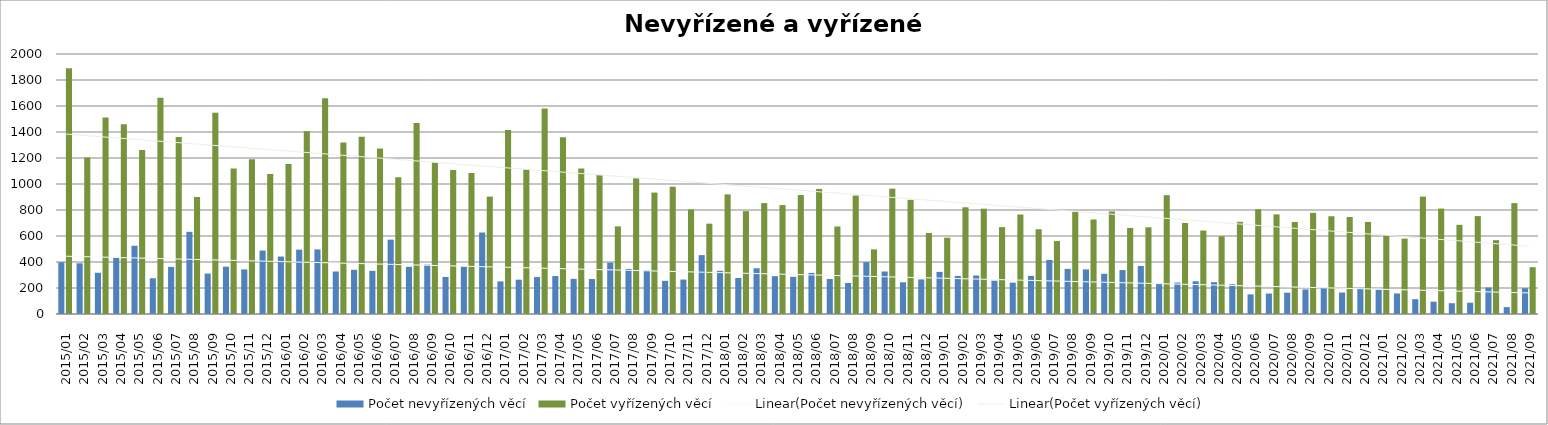
| Category | Počet nevyřízených věcí | Počet vyřízených věcí |
|---|---|---|
| 2015/01 | 398 | 1890 |
| 2015/02 | 390 | 1203 |
| 2015/03 | 317 | 1512 |
| 2015/04 | 436 | 1460 |
| 2015/05 | 525 | 1262 |
| 2015/06 | 275 | 1663 |
| 2015/07 | 362 | 1362 |
| 2015/08 | 632 | 900 |
| 2015/09 | 311 | 1548 |
| 2015/10 | 364 | 1120 |
| 2015/11 | 343 | 1191 |
| 2015/12 | 488 | 1076 |
| 2016/01 | 442 | 1154 |
| 2016/02 | 495 | 1406 |
| 2016/03 | 497 | 1659 |
| 2016/04 | 327 | 1319 |
| 2016/05 | 340 | 1363 |
| 2016/06 | 332 | 1273 |
| 2016/07 | 572 | 1051 |
| 2016/08 | 363 | 1469 |
| 2016/09 | 380 | 1167 |
| 2016/10 | 285 | 1108 |
| 2016/11 | 365 | 1084 |
| 2016/12 | 627 | 903 |
| 2017/01 | 251 | 1415 |
| 2017/02 | 264 | 1113 |
| 2017/03 | 284 | 1581 |
| 2017/04 | 292 | 1359 |
| 2017/05 | 270 | 1120 |
| 2017/06 | 269 | 1069 |
| 2017/07 | 395 | 674 |
| 2017/08 | 347 | 1045 |
| 2017/09 | 335 | 934 |
| 2017/10 | 255 | 979 |
| 2017/11 | 265 | 804 |
| 2017/12 | 453 | 695 |
| 2018/01 | 332 | 920 |
| 2018/02 | 277 | 791 |
| 2018/03 | 352 | 853 |
| 2018/04 | 291 | 838 |
| 2018/05 | 286 | 915 |
| 2018/06 | 316 | 962 |
| 2018/07 | 269 | 673 |
| 2018/08 | 239 | 911 |
| 2018/09 | 399 | 497 |
| 2018/10 | 327 | 964 |
| 2018/11 | 244 | 878 |
| 2018/12 | 266 | 623 |
| 2019/01 | 324 | 587 |
| 2019/02 | 293 | 821 |
| 2019/03 | 296 | 810 |
| 2019/04 | 256 | 668 |
| 2019/05 | 241 | 765 |
| 2019/06 | 293 | 652 |
| 2019/07 | 416 | 561 |
| 2019/08 | 347 | 787 |
| 2019/09 | 343 | 727 |
| 2019/10 | 309 | 789 |
| 2019/11 | 338 | 662 |
| 2019/12 | 369 | 667 |
| 2020/01 | 235 | 914 |
| 2020/02 | 242 | 700 |
| 2020/03 | 252 | 642 |
| 2020/04 | 245 | 598 |
| 2020/05 | 229 | 709 |
| 2020/06 | 151 | 806 |
| 2020/07 | 157 | 766 |
| 2020/08 | 164 | 708 |
| 2020/09 | 189 | 778 |
| 2020/10 | 199 | 752 |
| 2020/11 | 165 | 746 |
| 2020/12 | 197 | 708 |
| 2021/01 | 187 | 606 |
| 2021/02 | 158 | 580 |
| 2021/03 | 114 | 903 |
| 2021/04 | 95 | 811 |
| 2021/05 | 83 | 686 |
| 2021/06 | 87 | 753 |
| 2021/07 | 204 | 568 |
| 2021/08 | 53 | 853 |
| 2021/09 | 198 | 360 |